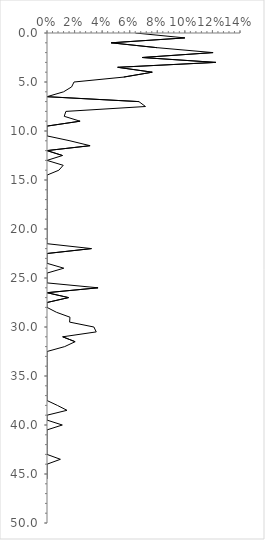
| Category | Series 0 |
|---|---|
| 0.06417112299465241 | 0 |
| 0.1 | 0.5 |
| 0.046511627906976744 | 1 |
| 0.08 | 1.5 |
| 0.12048192771084337 | 2 |
| 0.06896551724137931 | 2.5 |
| 0.12244897959183673 | 3 |
| 0.05128205128205128 | 3.5 |
| 0.07633587786259542 | 4 |
| 0.05555555555555555 | 4.5 |
| 0.0196078431372549 | 5 |
| 0.017857142857142856 | 5.5 |
| 0.012048192771084338 | 6 |
| 0.0 | 6.5 |
| 0.06666666666666667 | 7 |
| 0.07142857142857142 | 7.5 |
| 0.0136986301369863 | 8 |
| 0.0125 | 8.5 |
| 0.024 | 9 |
| 0.0 | 9.5 |
| 0.0 | 10 |
| 0.0 | 10.5 |
| 0.016666666666666666 | 11 |
| 0.03125 | 11.5 |
| 0.0 | 12 |
| 0.011235955056179775 | 12.5 |
| 0.0 | 13 |
| 0.011764705882352941 | 13.5 |
| 0.008620689655172414 | 14 |
| 0.0 | 14.5 |
| 0.0 | 15 |
| 0.0 | 15.5 |
| 0.0 | 16 |
| 0.0 | 16.5 |
| 0.0 | 17 |
| 0.0 | 17.5 |
| 0.0 | 18 |
| 0.0 | 18.5 |
| 0.0 | 19 |
| 0.0 | 19.5 |
| 0.0 | 20 |
| 0.0 | 20.5 |
| 0.0 | 21 |
| 0.0 | 21.5 |
| 0.03225806451612903 | 22 |
| 0.0 | 22.5 |
| 0.0 | 23 |
| 0.0 | 23.5 |
| 0.012195121951219513 | 24 |
| 0.0 | 24.5 |
| 0.0 | 25 |
| 0.0 | 25.5 |
| 0.037037037037037035 | 26 |
| 0.0 | 26.5 |
| 0.015625 | 27 |
| 0.0 | 27.5 |
| 0.0 | 28 |
| 0.006896551724137931 | 28.5 |
| 0.016666666666666666 | 29 |
| 0.01639344262295082 | 29.5 |
| 0.034013605442176874 | 30 |
| 0.03571428571428571 | 30.5 |
| 0.011363636363636364 | 31 |
| 0.02040816326530612 | 31.5 |
| 0.01282051282051282 | 32 |
| 0.0 | 32.5 |
| 0.0 | 33 |
| 0.0 | 33.5 |
| 0.0 | 34 |
| 0.0 | 34.5 |
| 0.0 | 35 |
| 0.0 | 35.5 |
| 0.0 | 36 |
| 0.0 | 36.5 |
| 0.0 | 37 |
| 0.0 | 37.5 |
| 0.007518796992481203 | 38 |
| 0.014492753623188406 | 38.5 |
| 0.0 | 39 |
| 0.0 | 39.5 |
| 0.011111111111111112 | 40 |
| 0.0 | 40.5 |
| 0.0 | 41 |
| 0.0 | 41.5 |
| 0.0 | 42 |
| 0.0 | 42.5 |
| 0.0 | 43 |
| 0.009708737864077669 | 43.5 |
| 0.0 | 44 |
| 0.0 | 44.5 |
| 0.0 | 45 |
| 0.0 | 45.5 |